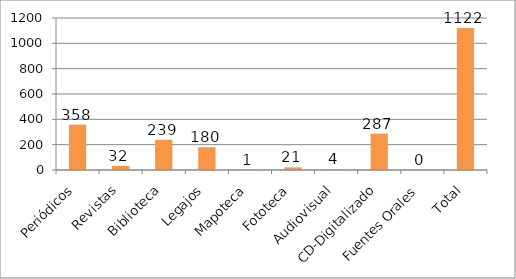
| Category | Series 0 |
|---|---|
| Periódicos | 358 |
| Revistas | 32 |
| Biblioteca | 239 |
| Legajos | 180 |
| Mapoteca | 1 |
| Fototeca | 21 |
| Audiovisual | 4 |
| CD-Digitalizado | 287 |
| Fuentes Orales | 0 |
| Total | 1122 |